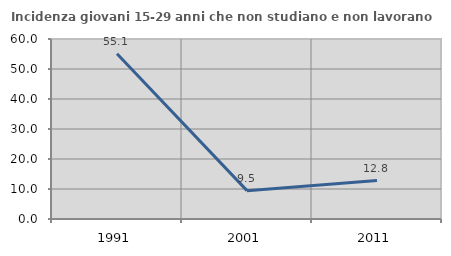
| Category | Incidenza giovani 15-29 anni che non studiano e non lavorano  |
|---|---|
| 1991.0 | 55.072 |
| 2001.0 | 9.456 |
| 2011.0 | 12.803 |